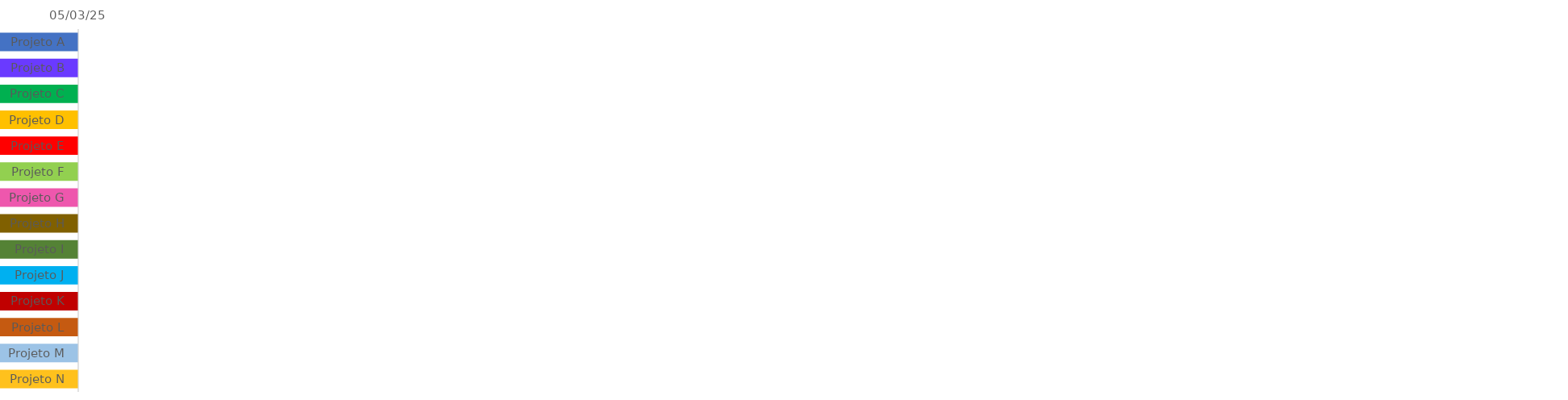
| Category | DATA DE 
INÍCIO | Duração |
|---|---|---|
| Projeto A |  | 1 |
| Projeto B |  | 1 |
| Projeto C |  | 1 |
| Projeto D |  | 1 |
| Projeto E |  | 1 |
| Projeto F |  | 1 |
| Projeto G |  | 1 |
| Projeto H |  | 1 |
| Projeto I |  | 1 |
| Projeto J |  | 1 |
| Projeto K |  | 1 |
| Projeto L |  | 1 |
| Projeto M |  | 1 |
| Projeto N |  | 1 |